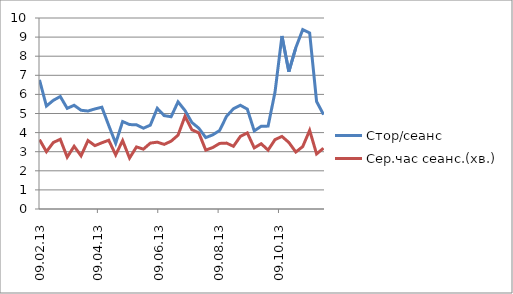
| Category | Стор/сеанс | Сер.час сеанс.(хв.) |
|---|---|---|
| 2013-02-09 | 6.76 | 3.633 |
| 2013-02-16 | 5.39 | 3 |
| 2013-02-23 | 5.69 | 3.483 |
| 2013-03-02 | 5.89 | 3.65 |
| 2013-03-09 | 5.27 | 2.717 |
| 2013-03-16 | 5.43 | 3.283 |
| 2013-03-23 | 5.17 | 2.783 |
| 2013-03-30 | 5.13 | 3.583 |
| 2013-04-06 | 5.24 | 3.317 |
| 2013-04-13 | 5.33 | 3.467 |
| 2013-04-20 | 4.37 | 3.6 |
| 2013-04-27 | 3.44 | 2.833 |
| 2013-05-04 | 4.58 | 3.583 |
| 2013-05-11 | 4.42 | 2.667 |
| 2013-05-18 | 4.41 | 3.25 |
| 2013-05-25 | 4.23 | 3.133 |
| 2013-06-01 | 4.39 | 3.45 |
| 2013-06-08 | 5.27 | 3.5 |
| 2013-06-15 | 4.89 | 3.383 |
| 2013-06-22 | 4.83 | 3.55 |
| 2013-06-29 | 5.61 | 3.867 |
| 2013-07-06 | 5.16 | 4.85 |
| 2013-07-13 | 4.53 | 4.15 |
| 2013-07-20 | 4.23 | 3.983 |
| 2013-07-27 | 3.74 | 3.083 |
| 2013-08-03 | 3.88 | 3.217 |
| 2013-08-10 | 4.11 | 3.433 |
| 2013-08-17 | 4.85 | 3.45 |
| 2013-08-24 | 5.25 | 3.283 |
| 2013-08-31 | 5.43 | 3.8 |
| 2013-09-07 | 5.23 | 3.983 |
| 2013-09-14 | 4.09 | 3.2 |
| 2013-09-21 | 4.33 | 3.417 |
| 2013-09-28 | 4.34 | 3.083 |
| 2013-10-05 | 6.12 | 3.633 |
| 2013-10-12 | 9.06 | 3.8 |
| 2013-10-19 | 7.19 | 3.483 |
| 2013-10-26 | 8.44 | 2.983 |
| 2013-11-02 | 9.39 | 3.267 |
| 2013-11-09 | 9.22 | 4.117 |
| 2013-11-16 | 5.63 | 2.883 |
| 2013-11-23 | 4.94 | 3.183 |